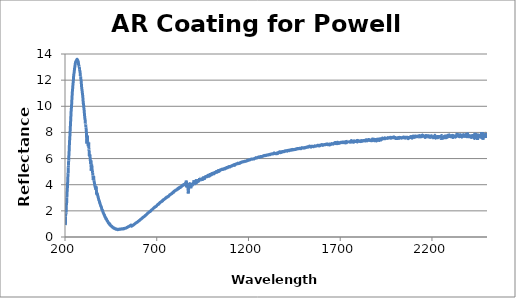
| Category | Reflectance (%) |
|---|---|
| 200.0 | 1.418 |
| 201.0 | 0.923 |
| 202.0 | 0.991 |
| 203.0 | 1.554 |
| 204.0 | 1.776 |
| 205.0 | 1.781 |
| 206.0 | 1.864 |
| 207.0 | 2.298 |
| 208.0 | 2.599 |
| 209.0 | 2.605 |
| 210.0 | 2.997 |
| 211.0 | 3.348 |
| 212.0 | 3.551 |
| 213.0 | 3.762 |
| 214.0 | 4.035 |
| 215.0 | 4.419 |
| 216.0 | 4.682 |
| 217.0 | 4.882 |
| 218.0 | 5.333 |
| 219.0 | 5.486 |
| 220.0 | 5.861 |
| 221.0 | 6.186 |
| 222.0 | 6.41 |
| 223.0 | 6.716 |
| 224.0 | 7.072 |
| 225.0 | 7.347 |
| 226.0 | 7.567 |
| 227.0 | 7.816 |
| 228.0 | 8.131 |
| 229.0 | 8.387 |
| 230.0 | 8.701 |
| 231.0 | 8.914 |
| 232.0 | 9.212 |
| 233.0 | 9.527 |
| 234.0 | 9.72 |
| 235.0 | 9.903 |
| 236.0 | 10.101 |
| 237.0 | 10.371 |
| 238.0 | 10.634 |
| 239.0 | 10.859 |
| 240.0 | 11.093 |
| 241.0 | 11.253 |
| 242.0 | 11.414 |
| 243.0 | 11.603 |
| 244.0 | 11.747 |
| 245.0 | 11.886 |
| 246.0 | 12.073 |
| 247.0 | 12.287 |
| 248.0 | 12.418 |
| 249.0 | 12.503 |
| 250.0 | 12.6 |
| 251.0 | 12.728 |
| 252.0 | 12.857 |
| 253.0 | 12.987 |
| 254.0 | 13.039 |
| 255.0 | 13.155 |
| 256.0 | 13.264 |
| 257.0 | 13.338 |
| 258.0 | 13.397 |
| 259.0 | 13.392 |
| 260.0 | 13.419 |
| 261.0 | 13.489 |
| 262.0 | 13.509 |
| 263.0 | 13.492 |
| 264.0 | 13.503 |
| 265.0 | 13.568 |
| 266.0 | 13.598 |
| 267.0 | 13.498 |
| 268.0 | 13.482 |
| 269.0 | 13.543 |
| 270.0 | 13.455 |
| 271.0 | 13.382 |
| 272.0 | 13.433 |
| 273.0 | 13.328 |
| 274.0 | 13.159 |
| 275.0 | 13.182 |
| 276.0 | 13.101 |
| 277.0 | 13.058 |
| 278.0 | 13.033 |
| 279.0 | 12.839 |
| 280.0 | 12.738 |
| 281.0 | 12.723 |
| 282.0 | 12.631 |
| 283.0 | 12.47 |
| 284.0 | 12.296 |
| 285.0 | 12.294 |
| 286.0 | 12.162 |
| 287.0 | 12.027 |
| 288.0 | 11.93 |
| 289.0 | 11.751 |
| 290.0 | 11.581 |
| 291.0 | 11.418 |
| 292.0 | 11.316 |
| 293.0 | 11.218 |
| 294.0 | 11.094 |
| 295.0 | 10.972 |
| 296.0 | 10.858 |
| 297.0 | 10.718 |
| 298.0 | 10.562 |
| 299.0 | 10.355 |
| 300.0 | 10.194 |
| 301.0 | 10.168 |
| 302.0 | 10.013 |
| 303.0 | 9.858 |
| 304.0 | 9.749 |
| 305.0 | 9.586 |
| 306.0 | 9.392 |
| 307.0 | 9.258 |
| 308.0 | 9.108 |
| 309.0 | 9.032 |
| 310.0 | 8.916 |
| 311.0 | 8.693 |
| 312.0 | 8.656 |
| 313.0 | 8.611 |
| 314.0 | 8.381 |
| 315.0 | 8.308 |
| 316.0 | 8.149 |
| 317.0 | 7.918 |
| 318.0 | 7.578 |
| 319.0 | 7.148 |
| 320.0 | 7.264 |
| 321.0 | 7.668 |
| 322.0 | 7.757 |
| 323.0 | 7.329 |
| 324.0 | 7.272 |
| 325.0 | 7.22 |
| 326.0 | 7.014 |
| 327.0 | 6.952 |
| 328.0 | 7.054 |
| 329.0 | 7.219 |
| 330.0 | 6.803 |
| 331.0 | 6.696 |
| 332.0 | 6.465 |
| 333.0 | 6.159 |
| 334.0 | 6.196 |
| 335.0 | 6.325 |
| 336.0 | 6.184 |
| 337.0 | 6.082 |
| 338.0 | 5.826 |
| 339.0 | 5.79 |
| 340.0 | 5.596 |
| 341.0 | 5.864 |
| 342.0 | 5.533 |
| 343.0 | 5.066 |
| 344.0 | 5.284 |
| 345.0 | 5.549 |
| 346.0 | 5.5 |
| 347.0 | 5.327 |
| 348.0 | 5.129 |
| 349.0 | 5.067 |
| 350.0 | 4.9 |
| 351.0 | 4.898 |
| 352.0 | 4.706 |
| 353.0 | 4.607 |
| 354.0 | 4.375 |
| 355.0 | 4.519 |
| 356.0 | 4.654 |
| 357.0 | 4.404 |
| 358.0 | 4.346 |
| 359.0 | 4.232 |
| 360.0 | 4.172 |
| 361.0 | 4.095 |
| 362.0 | 3.986 |
| 363.0 | 3.894 |
| 364.0 | 3.841 |
| 365.0 | 3.833 |
| 366.0 | 3.924 |
| 367.0 | 3.758 |
| 368.0 | 3.628 |
| 369.0 | 3.875 |
| 370.0 | 3.732 |
| 371.0 | 3.578 |
| 372.0 | 3.28 |
| 373.0 | 3.329 |
| 374.0 | 3.265 |
| 375.0 | 3.334 |
| 376.0 | 3.314 |
| 377.0 | 3.256 |
| 378.0 | 3.18 |
| 379.0 | 3.153 |
| 380.0 | 3.057 |
| 381.0 | 3.036 |
| 382.0 | 2.96 |
| 383.0 | 2.91 |
| 384.0 | 2.839 |
| 385.0 | 2.807 |
| 386.0 | 2.771 |
| 387.0 | 2.764 |
| 388.0 | 2.708 |
| 389.0 | 2.603 |
| 390.0 | 2.611 |
| 391.0 | 2.566 |
| 392.0 | 2.495 |
| 393.0 | 2.463 |
| 394.0 | 2.419 |
| 395.0 | 2.357 |
| 396.0 | 2.331 |
| 397.0 | 2.339 |
| 398.0 | 2.299 |
| 399.0 | 2.228 |
| 400.0 | 2.17 |
| 401.0 | 2.109 |
| 402.0 | 2.075 |
| 403.0 | 2.059 |
| 404.0 | 2.034 |
| 405.0 | 2.038 |
| 406.0 | 1.964 |
| 407.0 | 1.923 |
| 408.0 | 1.856 |
| 409.0 | 1.839 |
| 410.0 | 1.818 |
| 411.0 | 1.777 |
| 412.0 | 1.737 |
| 413.0 | 1.702 |
| 414.0 | 1.706 |
| 415.0 | 1.681 |
| 416.0 | 1.621 |
| 417.0 | 1.567 |
| 418.0 | 1.545 |
| 419.0 | 1.517 |
| 420.0 | 1.523 |
| 421.0 | 1.462 |
| 422.0 | 1.414 |
| 423.0 | 1.389 |
| 424.0 | 1.418 |
| 425.0 | 1.401 |
| 426.0 | 1.373 |
| 427.0 | 1.298 |
| 428.0 | 1.301 |
| 429.0 | 1.253 |
| 430.0 | 1.249 |
| 431.0 | 1.206 |
| 432.0 | 1.221 |
| 433.0 | 1.184 |
| 434.0 | 1.154 |
| 435.0 | 1.112 |
| 436.0 | 1.109 |
| 437.0 | 1.069 |
| 438.0 | 1.083 |
| 439.0 | 1.045 |
| 440.0 | 1.012 |
| 441.0 | 1.057 |
| 442.0 | 0.999 |
| 443.0 | 0.953 |
| 444.0 | 0.966 |
| 445.0 | 0.977 |
| 446.0 | 0.921 |
| 447.0 | 0.91 |
| 448.0 | 0.913 |
| 449.0 | 0.854 |
| 450.0 | 0.864 |
| 451.0 | 0.851 |
| 452.0 | 0.831 |
| 453.0 | 0.832 |
| 454.0 | 0.831 |
| 455.0 | 0.824 |
| 456.0 | 0.789 |
| 457.0 | 0.773 |
| 458.0 | 0.748 |
| 459.0 | 0.751 |
| 460.0 | 0.724 |
| 461.0 | 0.746 |
| 462.0 | 0.728 |
| 463.0 | 0.724 |
| 464.0 | 0.689 |
| 465.0 | 0.688 |
| 466.0 | 0.704 |
| 467.0 | 0.666 |
| 468.0 | 0.667 |
| 469.0 | 0.682 |
| 470.0 | 0.648 |
| 471.0 | 0.651 |
| 472.0 | 0.632 |
| 473.0 | 0.649 |
| 474.0 | 0.63 |
| 475.0 | 0.637 |
| 476.0 | 0.598 |
| 477.0 | 0.612 |
| 478.0 | 0.59 |
| 479.0 | 0.612 |
| 480.0 | 0.607 |
| 481.0 | 0.588 |
| 482.0 | 0.578 |
| 483.0 | 0.591 |
| 484.0 | 0.573 |
| 485.0 | 0.594 |
| 486.0 | 0.581 |
| 487.0 | 0.561 |
| 488.0 | 0.559 |
| 489.0 | 0.58 |
| 490.0 | 0.592 |
| 491.0 | 0.593 |
| 492.0 | 0.589 |
| 493.0 | 0.577 |
| 494.0 | 0.589 |
| 495.0 | 0.581 |
| 496.0 | 0.6 |
| 497.0 | 0.605 |
| 498.0 | 0.592 |
| 499.0 | 0.602 |
| 500.0 | 0.599 |
| 501.0 | 0.611 |
| 502.0 | 0.589 |
| 503.0 | 0.614 |
| 504.0 | 0.598 |
| 505.0 | 0.6 |
| 506.0 | 0.602 |
| 507.0 | 0.607 |
| 508.0 | 0.618 |
| 509.0 | 0.622 |
| 510.0 | 0.633 |
| 511.0 | 0.622 |
| 512.0 | 0.63 |
| 513.0 | 0.615 |
| 514.0 | 0.621 |
| 515.0 | 0.625 |
| 516.0 | 0.608 |
| 517.0 | 0.622 |
| 518.0 | 0.635 |
| 519.0 | 0.643 |
| 520.0 | 0.648 |
| 521.0 | 0.626 |
| 522.0 | 0.639 |
| 523.0 | 0.653 |
| 524.0 | 0.661 |
| 525.0 | 0.657 |
| 526.0 | 0.657 |
| 527.0 | 0.666 |
| 528.0 | 0.673 |
| 529.0 | 0.669 |
| 530.0 | 0.676 |
| 531.0 | 0.669 |
| 532.0 | 0.686 |
| 533.0 | 0.683 |
| 534.0 | 0.692 |
| 535.0 | 0.697 |
| 536.0 | 0.719 |
| 537.0 | 0.734 |
| 538.0 | 0.732 |
| 539.0 | 0.729 |
| 540.0 | 0.738 |
| 541.0 | 0.755 |
| 542.0 | 0.759 |
| 543.0 | 0.774 |
| 544.0 | 0.782 |
| 545.0 | 0.783 |
| 546.0 | 0.787 |
| 547.0 | 0.792 |
| 548.0 | 0.801 |
| 549.0 | 0.804 |
| 550.0 | 0.826 |
| 551.0 | 0.831 |
| 552.0 | 0.841 |
| 553.0 | 0.85 |
| 554.0 | 0.865 |
| 555.0 | 0.865 |
| 556.0 | 0.868 |
| 557.0 | 0.887 |
| 558.0 | 0.892 |
| 559.0 | 0.906 |
| 560.0 | 0.915 |
| 561.0 | 0.899 |
| 562.0 | 0.831 |
| 563.0 | 0.839 |
| 564.0 | 0.845 |
| 565.0 | 0.843 |
| 566.0 | 0.86 |
| 567.0 | 0.863 |
| 568.0 | 0.881 |
| 569.0 | 0.891 |
| 570.0 | 0.891 |
| 571.0 | 0.897 |
| 572.0 | 0.922 |
| 573.0 | 0.935 |
| 574.0 | 0.936 |
| 575.0 | 0.933 |
| 576.0 | 0.945 |
| 577.0 | 0.96 |
| 578.0 | 0.975 |
| 579.0 | 0.993 |
| 580.0 | 0.993 |
| 581.0 | 1.004 |
| 582.0 | 1.015 |
| 583.0 | 1.03 |
| 584.0 | 1.049 |
| 585.0 | 1.066 |
| 586.0 | 1.07 |
| 587.0 | 1.076 |
| 588.0 | 1.091 |
| 589.0 | 1.095 |
| 590.0 | 1.097 |
| 591.0 | 1.107 |
| 592.0 | 1.118 |
| 593.0 | 1.12 |
| 594.0 | 1.138 |
| 595.0 | 1.15 |
| 596.0 | 1.163 |
| 597.0 | 1.178 |
| 598.0 | 1.189 |
| 599.0 | 1.204 |
| 600.0 | 1.205 |
| 601.0 | 1.211 |
| 602.0 | 1.224 |
| 603.0 | 1.243 |
| 604.0 | 1.243 |
| 605.0 | 1.258 |
| 606.0 | 1.267 |
| 607.0 | 1.291 |
| 608.0 | 1.295 |
| 609.0 | 1.312 |
| 610.0 | 1.326 |
| 611.0 | 1.344 |
| 612.0 | 1.349 |
| 613.0 | 1.36 |
| 614.0 | 1.367 |
| 615.0 | 1.382 |
| 616.0 | 1.388 |
| 617.0 | 1.394 |
| 618.0 | 1.413 |
| 619.0 | 1.429 |
| 620.0 | 1.432 |
| 621.0 | 1.442 |
| 622.0 | 1.456 |
| 623.0 | 1.482 |
| 624.0 | 1.498 |
| 625.0 | 1.498 |
| 626.0 | 1.506 |
| 627.0 | 1.515 |
| 628.0 | 1.528 |
| 629.0 | 1.541 |
| 630.0 | 1.551 |
| 631.0 | 1.559 |
| 632.0 | 1.566 |
| 633.0 | 1.583 |
| 634.0 | 1.593 |
| 635.0 | 1.604 |
| 636.0 | 1.613 |
| 637.0 | 1.629 |
| 638.0 | 1.649 |
| 639.0 | 1.66 |
| 640.0 | 1.665 |
| 641.0 | 1.677 |
| 642.0 | 1.696 |
| 643.0 | 1.706 |
| 644.0 | 1.714 |
| 645.0 | 1.731 |
| 646.0 | 1.742 |
| 647.0 | 1.755 |
| 648.0 | 1.772 |
| 649.0 | 1.78 |
| 650.0 | 1.799 |
| 651.0 | 1.83 |
| 652.0 | 1.842 |
| 653.0 | 1.844 |
| 654.0 | 1.86 |
| 655.0 | 1.871 |
| 656.0 | 1.872 |
| 657.0 | 1.886 |
| 658.0 | 1.904 |
| 659.0 | 1.909 |
| 660.0 | 1.92 |
| 661.0 | 1.934 |
| 662.0 | 1.938 |
| 663.0 | 1.937 |
| 664.0 | 1.947 |
| 665.0 | 1.971 |
| 666.0 | 1.984 |
| 667.0 | 1.99 |
| 668.0 | 2.009 |
| 669.0 | 2.024 |
| 670.0 | 2.038 |
| 671.0 | 2.05 |
| 672.0 | 2.067 |
| 673.0 | 2.08 |
| 674.0 | 2.078 |
| 675.0 | 2.095 |
| 676.0 | 2.111 |
| 677.0 | 2.113 |
| 678.0 | 2.129 |
| 679.0 | 2.153 |
| 680.0 | 2.161 |
| 681.0 | 2.172 |
| 682.0 | 2.195 |
| 683.0 | 2.201 |
| 684.0 | 2.217 |
| 685.0 | 2.226 |
| 686.0 | 2.242 |
| 687.0 | 2.264 |
| 688.0 | 2.263 |
| 689.0 | 2.276 |
| 690.0 | 2.297 |
| 691.0 | 2.312 |
| 692.0 | 2.319 |
| 693.0 | 2.326 |
| 694.0 | 2.321 |
| 695.0 | 2.323 |
| 696.0 | 2.333 |
| 697.0 | 2.345 |
| 698.0 | 2.362 |
| 699.0 | 2.371 |
| 700.0 | 2.391 |
| 701.0 | 2.419 |
| 702.0 | 2.429 |
| 703.0 | 2.443 |
| 704.0 | 2.47 |
| 705.0 | 2.483 |
| 706.0 | 2.483 |
| 707.0 | 2.502 |
| 708.0 | 2.502 |
| 709.0 | 2.497 |
| 710.0 | 2.497 |
| 711.0 | 2.527 |
| 712.0 | 2.556 |
| 713.0 | 2.569 |
| 714.0 | 2.559 |
| 715.0 | 2.573 |
| 716.0 | 2.614 |
| 717.0 | 2.633 |
| 718.0 | 2.644 |
| 719.0 | 2.638 |
| 720.0 | 2.658 |
| 721.0 | 2.67 |
| 722.0 | 2.68 |
| 723.0 | 2.684 |
| 724.0 | 2.692 |
| 725.0 | 2.709 |
| 726.0 | 2.705 |
| 727.0 | 2.706 |
| 728.0 | 2.715 |
| 729.0 | 2.759 |
| 730.0 | 2.78 |
| 731.0 | 2.763 |
| 732.0 | 2.766 |
| 733.0 | 2.8 |
| 734.0 | 2.818 |
| 735.0 | 2.844 |
| 736.0 | 2.83 |
| 737.0 | 2.857 |
| 738.0 | 2.859 |
| 739.0 | 2.861 |
| 740.0 | 2.884 |
| 741.0 | 2.88 |
| 742.0 | 2.899 |
| 743.0 | 2.912 |
| 744.0 | 2.922 |
| 745.0 | 2.914 |
| 746.0 | 2.934 |
| 747.0 | 2.95 |
| 748.0 | 2.982 |
| 749.0 | 2.971 |
| 750.0 | 2.971 |
| 751.0 | 2.99 |
| 752.0 | 3.032 |
| 753.0 | 3.043 |
| 754.0 | 3.04 |
| 755.0 | 3.027 |
| 756.0 | 3.046 |
| 757.0 | 3.068 |
| 758.0 | 3.063 |
| 759.0 | 3.058 |
| 760.0 | 3.079 |
| 761.0 | 3.105 |
| 762.0 | 3.098 |
| 763.0 | 3.118 |
| 764.0 | 3.104 |
| 765.0 | 3.116 |
| 766.0 | 3.144 |
| 767.0 | 3.16 |
| 768.0 | 3.172 |
| 769.0 | 3.192 |
| 770.0 | 3.211 |
| 771.0 | 3.236 |
| 772.0 | 3.236 |
| 773.0 | 3.244 |
| 774.0 | 3.24 |
| 775.0 | 3.254 |
| 776.0 | 3.258 |
| 777.0 | 3.288 |
| 778.0 | 3.302 |
| 779.0 | 3.294 |
| 780.0 | 3.303 |
| 781.0 | 3.325 |
| 782.0 | 3.31 |
| 783.0 | 3.326 |
| 784.0 | 3.346 |
| 785.0 | 3.378 |
| 786.0 | 3.369 |
| 787.0 | 3.387 |
| 788.0 | 3.389 |
| 789.0 | 3.421 |
| 790.0 | 3.446 |
| 791.0 | 3.44 |
| 792.0 | 3.415 |
| 793.0 | 3.438 |
| 794.0 | 3.459 |
| 795.0 | 3.507 |
| 796.0 | 3.502 |
| 797.0 | 3.507 |
| 798.0 | 3.513 |
| 799.0 | 3.538 |
| 800.0 | 3.544 |
| 801.0 | 3.565 |
| 802.0 | 3.563 |
| 803.0 | 3.587 |
| 804.0 | 3.572 |
| 805.0 | 3.601 |
| 806.0 | 3.57 |
| 807.0 | 3.613 |
| 808.0 | 3.619 |
| 809.0 | 3.616 |
| 810.0 | 3.634 |
| 811.0 | 3.629 |
| 812.0 | 3.659 |
| 813.0 | 3.686 |
| 814.0 | 3.681 |
| 815.0 | 3.685 |
| 816.0 | 3.67 |
| 817.0 | 3.71 |
| 818.0 | 3.731 |
| 819.0 | 3.751 |
| 820.0 | 3.704 |
| 821.0 | 3.773 |
| 822.0 | 3.752 |
| 823.0 | 3.782 |
| 824.0 | 3.75 |
| 825.0 | 3.795 |
| 826.0 | 3.809 |
| 827.0 | 3.796 |
| 828.0 | 3.781 |
| 829.0 | 3.834 |
| 830.0 | 3.817 |
| 831.0 | 3.848 |
| 832.0 | 3.821 |
| 833.0 | 3.836 |
| 834.0 | 3.869 |
| 835.0 | 3.901 |
| 836.0 | 3.908 |
| 837.0 | 3.929 |
| 838.0 | 3.896 |
| 839.0 | 3.929 |
| 840.0 | 3.96 |
| 841.0 | 3.968 |
| 842.0 | 3.959 |
| 843.0 | 3.965 |
| 844.0 | 3.989 |
| 845.0 | 3.98 |
| 846.0 | 3.958 |
| 847.0 | 3.982 |
| 848.0 | 4.003 |
| 849.0 | 4.03 |
| 850.0 | 4.018 |
| 851.0 | 4.041 |
| 852.0 | 4.053 |
| 853.0 | 4.05 |
| 854.0 | 4.082 |
| 855.0 | 4.081 |
| 856.0 | 4.098 |
| 857.0 | 4.101 |
| 858.0 | 4.125 |
| 859.0 | 4.145 |
| 860.0 | 4.112 |
| 861.0 | 4.316 |
| 862.0 | 4.213 |
| 863.0 | 3.782 |
| 864.0 | 3.799 |
| 865.0 | 3.939 |
| 866.0 | 3.841 |
| 867.0 | 3.995 |
| 868.0 | 4.025 |
| 869.0 | 3.879 |
| 870.0 | 3.832 |
| 871.0 | 3.58 |
| 872.0 | 3.328 |
| 873.0 | 3.581 |
| 874.0 | 3.704 |
| 875.0 | 3.71 |
| 876.0 | 3.829 |
| 877.0 | 4.11 |
| 878.0 | 4.031 |
| 879.0 | 4.071 |
| 880.0 | 4.087 |
| 881.0 | 4.075 |
| 882.0 | 4.068 |
| 883.0 | 3.939 |
| 884.0 | 3.921 |
| 885.0 | 3.9 |
| 886.0 | 3.733 |
| 887.0 | 3.795 |
| 888.0 | 3.954 |
| 889.0 | 4.061 |
| 890.0 | 4.006 |
| 891.0 | 4.037 |
| 892.0 | 3.928 |
| 893.0 | 3.976 |
| 894.0 | 3.975 |
| 895.0 | 3.931 |
| 896.0 | 4.076 |
| 897.0 | 4.012 |
| 898.0 | 4.103 |
| 899.0 | 4.055 |
| 900.0 | 4.105 |
| 901.0 | 4.09 |
| 902.0 | 4.049 |
| 903.0 | 4.345 |
| 904.0 | 4.184 |
| 905.0 | 4.174 |
| 906.0 | 4.007 |
| 907.0 | 4.097 |
| 908.0 | 4.102 |
| 909.0 | 4.065 |
| 910.0 | 4.124 |
| 911.0 | 4.215 |
| 912.0 | 4.256 |
| 913.0 | 4.303 |
| 914.0 | 4.33 |
| 915.0 | 4.297 |
| 916.0 | 4.152 |
| 917.0 | 4.157 |
| 918.0 | 4.215 |
| 919.0 | 4.229 |
| 920.0 | 4.197 |
| 921.0 | 4.216 |
| 922.0 | 4.306 |
| 923.0 | 4.324 |
| 924.0 | 4.281 |
| 925.0 | 4.247 |
| 926.0 | 4.323 |
| 927.0 | 4.238 |
| 928.0 | 4.281 |
| 929.0 | 4.312 |
| 930.0 | 4.33 |
| 931.0 | 4.296 |
| 932.0 | 4.348 |
| 933.0 | 4.505 |
| 934.0 | 4.5 |
| 935.0 | 4.503 |
| 936.0 | 4.329 |
| 937.0 | 4.392 |
| 938.0 | 4.413 |
| 939.0 | 4.424 |
| 940.0 | 4.395 |
| 941.0 | 4.372 |
| 942.0 | 4.391 |
| 943.0 | 4.384 |
| 944.0 | 4.385 |
| 945.0 | 4.393 |
| 946.0 | 4.423 |
| 947.0 | 4.415 |
| 948.0 | 4.536 |
| 949.0 | 4.434 |
| 950.0 | 4.403 |
| 951.0 | 4.411 |
| 952.0 | 4.527 |
| 953.0 | 4.523 |
| 954.0 | 4.512 |
| 955.0 | 4.525 |
| 956.0 | 4.463 |
| 957.0 | 4.512 |
| 958.0 | 4.532 |
| 959.0 | 4.554 |
| 960.0 | 4.506 |
| 961.0 | 4.466 |
| 962.0 | 4.489 |
| 963.0 | 4.519 |
| 964.0 | 4.611 |
| 965.0 | 4.573 |
| 966.0 | 4.608 |
| 967.0 | 4.581 |
| 968.0 | 4.629 |
| 969.0 | 4.61 |
| 970.0 | 4.639 |
| 971.0 | 4.643 |
| 972.0 | 4.648 |
| 973.0 | 4.627 |
| 974.0 | 4.629 |
| 975.0 | 4.623 |
| 976.0 | 4.614 |
| 977.0 | 4.632 |
| 978.0 | 4.702 |
| 979.0 | 4.699 |
| 980.0 | 4.722 |
| 981.0 | 4.722 |
| 982.0 | 4.714 |
| 983.0 | 4.707 |
| 984.0 | 4.716 |
| 985.0 | 4.705 |
| 986.0 | 4.646 |
| 987.0 | 4.733 |
| 988.0 | 4.705 |
| 989.0 | 4.786 |
| 990.0 | 4.735 |
| 991.0 | 4.754 |
| 992.0 | 4.752 |
| 993.0 | 4.715 |
| 994.0 | 4.765 |
| 995.0 | 4.794 |
| 996.0 | 4.791 |
| 997.0 | 4.826 |
| 998.0 | 4.755 |
| 999.0 | 4.842 |
| 1000.0 | 4.841 |
| 1001.0 | 4.783 |
| 1002.0 | 4.819 |
| 1003.0 | 4.846 |
| 1004.0 | 4.835 |
| 1005.0 | 4.867 |
| 1006.0 | 4.873 |
| 1007.0 | 4.85 |
| 1008.0 | 4.892 |
| 1009.0 | 4.861 |
| 1010.0 | 4.858 |
| 1011.0 | 4.882 |
| 1012.0 | 4.829 |
| 1013.0 | 4.863 |
| 1014.0 | 4.929 |
| 1015.0 | 4.899 |
| 1016.0 | 4.925 |
| 1017.0 | 4.899 |
| 1018.0 | 4.925 |
| 1019.0 | 4.905 |
| 1020.0 | 4.92 |
| 1021.0 | 4.921 |
| 1022.0 | 4.952 |
| 1023.0 | 4.966 |
| 1024.0 | 5.009 |
| 1025.0 | 4.954 |
| 1026.0 | 4.984 |
| 1027.0 | 4.97 |
| 1028.0 | 4.978 |
| 1029.0 | 4.946 |
| 1030.0 | 5.027 |
| 1031.0 | 4.999 |
| 1032.0 | 5.009 |
| 1033.0 | 5.008 |
| 1034.0 | 5.026 |
| 1035.0 | 5.087 |
| 1036.0 | 5.072 |
| 1037.0 | 5.01 |
| 1038.0 | 5.064 |
| 1039.0 | 5.085 |
| 1040.0 | 5.037 |
| 1041.0 | 5.032 |
| 1042.0 | 5.095 |
| 1043.0 | 5.1 |
| 1044.0 | 5.122 |
| 1045.0 | 5.076 |
| 1046.0 | 5.122 |
| 1047.0 | 5.108 |
| 1048.0 | 5.121 |
| 1049.0 | 5.144 |
| 1050.0 | 5.13 |
| 1051.0 | 5.16 |
| 1052.0 | 5.177 |
| 1053.0 | 5.172 |
| 1054.0 | 5.176 |
| 1055.0 | 5.175 |
| 1056.0 | 5.184 |
| 1057.0 | 5.196 |
| 1058.0 | 5.187 |
| 1059.0 | 5.159 |
| 1060.0 | 5.171 |
| 1061.0 | 5.195 |
| 1062.0 | 5.198 |
| 1063.0 | 5.198 |
| 1064.0 | 5.21 |
| 1065.0 | 5.222 |
| 1066.0 | 5.195 |
| 1067.0 | 5.202 |
| 1068.0 | 5.209 |
| 1069.0 | 5.234 |
| 1070.0 | 5.231 |
| 1071.0 | 5.244 |
| 1072.0 | 5.203 |
| 1073.0 | 5.249 |
| 1074.0 | 5.274 |
| 1075.0 | 5.26 |
| 1076.0 | 5.245 |
| 1077.0 | 5.256 |
| 1078.0 | 5.276 |
| 1079.0 | 5.275 |
| 1080.0 | 5.273 |
| 1081.0 | 5.279 |
| 1082.0 | 5.324 |
| 1083.0 | 5.312 |
| 1084.0 | 5.323 |
| 1085.0 | 5.322 |
| 1086.0 | 5.298 |
| 1087.0 | 5.334 |
| 1088.0 | 5.327 |
| 1089.0 | 5.324 |
| 1090.0 | 5.34 |
| 1091.0 | 5.375 |
| 1092.0 | 5.379 |
| 1093.0 | 5.385 |
| 1094.0 | 5.385 |
| 1095.0 | 5.352 |
| 1096.0 | 5.36 |
| 1097.0 | 5.358 |
| 1098.0 | 5.379 |
| 1099.0 | 5.388 |
| 1100.0 | 5.368 |
| 1101.0 | 5.37 |
| 1102.0 | 5.401 |
| 1103.0 | 5.396 |
| 1104.0 | 5.4 |
| 1105.0 | 5.407 |
| 1106.0 | 5.441 |
| 1107.0 | 5.434 |
| 1108.0 | 5.435 |
| 1109.0 | 5.424 |
| 1110.0 | 5.431 |
| 1111.0 | 5.446 |
| 1112.0 | 5.462 |
| 1113.0 | 5.472 |
| 1114.0 | 5.462 |
| 1115.0 | 5.471 |
| 1116.0 | 5.495 |
| 1117.0 | 5.484 |
| 1118.0 | 5.495 |
| 1119.0 | 5.521 |
| 1120.0 | 5.525 |
| 1121.0 | 5.508 |
| 1122.0 | 5.526 |
| 1123.0 | 5.535 |
| 1124.0 | 5.504 |
| 1125.0 | 5.48 |
| 1126.0 | 5.544 |
| 1127.0 | 5.555 |
| 1128.0 | 5.545 |
| 1129.0 | 5.564 |
| 1130.0 | 5.575 |
| 1131.0 | 5.584 |
| 1132.0 | 5.565 |
| 1133.0 | 5.571 |
| 1134.0 | 5.568 |
| 1135.0 | 5.575 |
| 1136.0 | 5.592 |
| 1137.0 | 5.608 |
| 1138.0 | 5.616 |
| 1139.0 | 5.609 |
| 1140.0 | 5.62 |
| 1141.0 | 5.65 |
| 1142.0 | 5.63 |
| 1143.0 | 5.609 |
| 1144.0 | 5.615 |
| 1145.0 | 5.624 |
| 1146.0 | 5.629 |
| 1147.0 | 5.617 |
| 1148.0 | 5.625 |
| 1149.0 | 5.621 |
| 1150.0 | 5.65 |
| 1151.0 | 5.651 |
| 1152.0 | 5.634 |
| 1153.0 | 5.636 |
| 1154.0 | 5.658 |
| 1155.0 | 5.683 |
| 1156.0 | 5.699 |
| 1157.0 | 5.707 |
| 1158.0 | 5.698 |
| 1159.0 | 5.687 |
| 1160.0 | 5.7 |
| 1161.0 | 5.726 |
| 1162.0 | 5.72 |
| 1163.0 | 5.716 |
| 1164.0 | 5.727 |
| 1165.0 | 5.748 |
| 1166.0 | 5.746 |
| 1167.0 | 5.735 |
| 1168.0 | 5.737 |
| 1169.0 | 5.741 |
| 1170.0 | 5.749 |
| 1171.0 | 5.764 |
| 1172.0 | 5.759 |
| 1173.0 | 5.752 |
| 1174.0 | 5.757 |
| 1175.0 | 5.758 |
| 1176.0 | 5.775 |
| 1177.0 | 5.789 |
| 1178.0 | 5.785 |
| 1179.0 | 5.792 |
| 1180.0 | 5.802 |
| 1181.0 | 5.796 |
| 1182.0 | 5.789 |
| 1183.0 | 5.79 |
| 1184.0 | 5.783 |
| 1185.0 | 5.797 |
| 1186.0 | 5.797 |
| 1187.0 | 5.807 |
| 1188.0 | 5.824 |
| 1189.0 | 5.827 |
| 1190.0 | 5.829 |
| 1191.0 | 5.835 |
| 1192.0 | 5.849 |
| 1193.0 | 5.841 |
| 1194.0 | 5.837 |
| 1195.0 | 5.836 |
| 1196.0 | 5.849 |
| 1197.0 | 5.88 |
| 1198.0 | 5.885 |
| 1199.0 | 5.885 |
| 1200.0 | 5.887 |
| 1201.0 | 5.875 |
| 1202.0 | 5.881 |
| 1203.0 | 5.883 |
| 1204.0 | 5.889 |
| 1205.0 | 5.908 |
| 1206.0 | 5.91 |
| 1207.0 | 5.902 |
| 1208.0 | 5.895 |
| 1209.0 | 5.916 |
| 1210.0 | 5.929 |
| 1211.0 | 5.921 |
| 1212.0 | 5.926 |
| 1213.0 | 5.934 |
| 1214.0 | 5.947 |
| 1215.0 | 5.963 |
| 1216.0 | 5.962 |
| 1217.0 | 5.946 |
| 1218.0 | 5.943 |
| 1219.0 | 5.941 |
| 1220.0 | 5.962 |
| 1221.0 | 5.967 |
| 1222.0 | 5.954 |
| 1223.0 | 5.97 |
| 1224.0 | 5.972 |
| 1225.0 | 5.97 |
| 1226.0 | 5.968 |
| 1227.0 | 5.978 |
| 1228.0 | 5.989 |
| 1229.0 | 5.992 |
| 1230.0 | 5.985 |
| 1231.0 | 5.97 |
| 1232.0 | 5.979 |
| 1233.0 | 5.994 |
| 1234.0 | 6.012 |
| 1235.0 | 6.021 |
| 1236.0 | 6.02 |
| 1237.0 | 6.035 |
| 1238.0 | 6.04 |
| 1239.0 | 6.056 |
| 1240.0 | 6.073 |
| 1241.0 | 6.059 |
| 1242.0 | 6.041 |
| 1243.0 | 6.034 |
| 1244.0 | 6.053 |
| 1245.0 | 6.064 |
| 1246.0 | 6.056 |
| 1247.0 | 6.052 |
| 1248.0 | 6.059 |
| 1249.0 | 6.091 |
| 1250.0 | 6.092 |
| 1251.0 | 6.095 |
| 1252.0 | 6.096 |
| 1253.0 | 6.101 |
| 1254.0 | 6.112 |
| 1255.0 | 6.113 |
| 1256.0 | 6.129 |
| 1257.0 | 6.131 |
| 1258.0 | 6.131 |
| 1259.0 | 6.124 |
| 1260.0 | 6.09 |
| 1261.0 | 6.096 |
| 1262.0 | 6.098 |
| 1263.0 | 6.115 |
| 1264.0 | 6.145 |
| 1265.0 | 6.152 |
| 1266.0 | 6.151 |
| 1267.0 | 6.154 |
| 1268.0 | 6.16 |
| 1269.0 | 6.146 |
| 1270.0 | 6.151 |
| 1271.0 | 6.144 |
| 1272.0 | 6.15 |
| 1273.0 | 6.16 |
| 1274.0 | 6.166 |
| 1275.0 | 6.157 |
| 1276.0 | 6.167 |
| 1277.0 | 6.179 |
| 1278.0 | 6.173 |
| 1279.0 | 6.178 |
| 1280.0 | 6.198 |
| 1281.0 | 6.205 |
| 1282.0 | 6.219 |
| 1283.0 | 6.227 |
| 1284.0 | 6.23 |
| 1285.0 | 6.223 |
| 1286.0 | 6.215 |
| 1287.0 | 6.221 |
| 1288.0 | 6.246 |
| 1289.0 | 6.23 |
| 1290.0 | 6.232 |
| 1291.0 | 6.217 |
| 1292.0 | 6.234 |
| 1293.0 | 6.248 |
| 1294.0 | 6.252 |
| 1295.0 | 6.256 |
| 1296.0 | 6.243 |
| 1297.0 | 6.237 |
| 1298.0 | 6.264 |
| 1299.0 | 6.256 |
| 1300.0 | 6.251 |
| 1301.0 | 6.263 |
| 1302.0 | 6.265 |
| 1303.0 | 6.279 |
| 1304.0 | 6.279 |
| 1305.0 | 6.274 |
| 1306.0 | 6.287 |
| 1307.0 | 6.294 |
| 1308.0 | 6.294 |
| 1309.0 | 6.288 |
| 1310.0 | 6.278 |
| 1311.0 | 6.286 |
| 1312.0 | 6.294 |
| 1313.0 | 6.306 |
| 1314.0 | 6.327 |
| 1315.0 | 6.306 |
| 1316.0 | 6.303 |
| 1317.0 | 6.316 |
| 1318.0 | 6.299 |
| 1319.0 | 6.307 |
| 1320.0 | 6.316 |
| 1321.0 | 6.339 |
| 1322.0 | 6.335 |
| 1323.0 | 6.331 |
| 1324.0 | 6.341 |
| 1325.0 | 6.34 |
| 1326.0 | 6.355 |
| 1327.0 | 6.361 |
| 1328.0 | 6.364 |
| 1329.0 | 6.365 |
| 1330.0 | 6.36 |
| 1331.0 | 6.35 |
| 1332.0 | 6.345 |
| 1333.0 | 6.366 |
| 1334.0 | 6.379 |
| 1335.0 | 6.382 |
| 1336.0 | 6.383 |
| 1337.0 | 6.365 |
| 1338.0 | 6.403 |
| 1339.0 | 6.417 |
| 1340.0 | 6.439 |
| 1341.0 | 6.417 |
| 1342.0 | 6.391 |
| 1343.0 | 6.407 |
| 1344.0 | 6.392 |
| 1345.0 | 6.384 |
| 1346.0 | 6.384 |
| 1347.0 | 6.382 |
| 1348.0 | 6.374 |
| 1349.0 | 6.371 |
| 1350.0 | 6.367 |
| 1351.0 | 6.385 |
| 1352.0 | 6.405 |
| 1353.0 | 6.373 |
| 1354.0 | 6.366 |
| 1355.0 | 6.387 |
| 1356.0 | 6.374 |
| 1357.0 | 6.437 |
| 1358.0 | 6.443 |
| 1359.0 | 6.392 |
| 1360.0 | 6.388 |
| 1361.0 | 6.434 |
| 1362.0 | 6.46 |
| 1363.0 | 6.451 |
| 1364.0 | 6.474 |
| 1365.0 | 6.484 |
| 1366.0 | 6.471 |
| 1367.0 | 6.468 |
| 1368.0 | 6.493 |
| 1369.0 | 6.518 |
| 1370.0 | 6.477 |
| 1371.0 | 6.509 |
| 1372.0 | 6.52 |
| 1373.0 | 6.454 |
| 1374.0 | 6.462 |
| 1375.0 | 6.494 |
| 1376.0 | 6.479 |
| 1377.0 | 6.501 |
| 1378.0 | 6.517 |
| 1379.0 | 6.504 |
| 1380.0 | 6.474 |
| 1381.0 | 6.48 |
| 1382.0 | 6.521 |
| 1383.0 | 6.533 |
| 1384.0 | 6.538 |
| 1385.0 | 6.521 |
| 1386.0 | 6.549 |
| 1387.0 | 6.52 |
| 1388.0 | 6.516 |
| 1389.0 | 6.531 |
| 1390.0 | 6.522 |
| 1391.0 | 6.547 |
| 1392.0 | 6.522 |
| 1393.0 | 6.547 |
| 1394.0 | 6.558 |
| 1395.0 | 6.556 |
| 1396.0 | 6.528 |
| 1397.0 | 6.558 |
| 1398.0 | 6.586 |
| 1399.0 | 6.557 |
| 1400.0 | 6.586 |
| 1401.0 | 6.597 |
| 1402.0 | 6.568 |
| 1403.0 | 6.598 |
| 1404.0 | 6.598 |
| 1405.0 | 6.597 |
| 1406.0 | 6.602 |
| 1407.0 | 6.58 |
| 1408.0 | 6.602 |
| 1409.0 | 6.606 |
| 1410.0 | 6.582 |
| 1411.0 | 6.559 |
| 1412.0 | 6.578 |
| 1413.0 | 6.584 |
| 1414.0 | 6.584 |
| 1415.0 | 6.62 |
| 1416.0 | 6.636 |
| 1417.0 | 6.624 |
| 1418.0 | 6.615 |
| 1419.0 | 6.625 |
| 1420.0 | 6.627 |
| 1421.0 | 6.643 |
| 1422.0 | 6.616 |
| 1423.0 | 6.61 |
| 1424.0 | 6.609 |
| 1425.0 | 6.651 |
| 1426.0 | 6.634 |
| 1427.0 | 6.644 |
| 1428.0 | 6.642 |
| 1429.0 | 6.663 |
| 1430.0 | 6.673 |
| 1431.0 | 6.668 |
| 1432.0 | 6.662 |
| 1433.0 | 6.65 |
| 1434.0 | 6.64 |
| 1435.0 | 6.654 |
| 1436.0 | 6.692 |
| 1437.0 | 6.686 |
| 1438.0 | 6.661 |
| 1439.0 | 6.7 |
| 1440.0 | 6.7 |
| 1441.0 | 6.661 |
| 1442.0 | 6.673 |
| 1443.0 | 6.668 |
| 1444.0 | 6.679 |
| 1445.0 | 6.681 |
| 1446.0 | 6.698 |
| 1447.0 | 6.696 |
| 1448.0 | 6.678 |
| 1449.0 | 6.698 |
| 1450.0 | 6.699 |
| 1451.0 | 6.684 |
| 1452.0 | 6.689 |
| 1453.0 | 6.711 |
| 1454.0 | 6.697 |
| 1455.0 | 6.715 |
| 1456.0 | 6.726 |
| 1457.0 | 6.696 |
| 1458.0 | 6.719 |
| 1459.0 | 6.738 |
| 1460.0 | 6.735 |
| 1461.0 | 6.73 |
| 1462.0 | 6.717 |
| 1463.0 | 6.722 |
| 1464.0 | 6.723 |
| 1465.0 | 6.734 |
| 1466.0 | 6.768 |
| 1467.0 | 6.775 |
| 1468.0 | 6.758 |
| 1469.0 | 6.765 |
| 1470.0 | 6.748 |
| 1471.0 | 6.763 |
| 1472.0 | 6.758 |
| 1473.0 | 6.751 |
| 1474.0 | 6.757 |
| 1475.0 | 6.77 |
| 1476.0 | 6.762 |
| 1477.0 | 6.779 |
| 1478.0 | 6.761 |
| 1479.0 | 6.786 |
| 1480.0 | 6.792 |
| 1481.0 | 6.768 |
| 1482.0 | 6.761 |
| 1483.0 | 6.786 |
| 1484.0 | 6.792 |
| 1485.0 | 6.777 |
| 1486.0 | 6.761 |
| 1487.0 | 6.76 |
| 1488.0 | 6.784 |
| 1489.0 | 6.799 |
| 1490.0 | 6.828 |
| 1491.0 | 6.836 |
| 1492.0 | 6.815 |
| 1493.0 | 6.816 |
| 1494.0 | 6.823 |
| 1495.0 | 6.811 |
| 1496.0 | 6.819 |
| 1497.0 | 6.805 |
| 1498.0 | 6.807 |
| 1499.0 | 6.823 |
| 1500.0 | 6.826 |
| 1501.0 | 6.811 |
| 1502.0 | 6.796 |
| 1503.0 | 6.826 |
| 1504.0 | 6.824 |
| 1505.0 | 6.808 |
| 1506.0 | 6.806 |
| 1507.0 | 6.83 |
| 1508.0 | 6.849 |
| 1509.0 | 6.845 |
| 1510.0 | 6.842 |
| 1511.0 | 6.832 |
| 1512.0 | 6.844 |
| 1513.0 | 6.852 |
| 1514.0 | 6.84 |
| 1515.0 | 6.867 |
| 1516.0 | 6.875 |
| 1517.0 | 6.857 |
| 1518.0 | 6.863 |
| 1519.0 | 6.889 |
| 1520.0 | 6.895 |
| 1521.0 | 6.894 |
| 1522.0 | 6.869 |
| 1523.0 | 6.859 |
| 1524.0 | 6.861 |
| 1525.0 | 6.879 |
| 1526.0 | 6.907 |
| 1527.0 | 6.913 |
| 1528.0 | 6.907 |
| 1529.0 | 6.923 |
| 1530.0 | 6.912 |
| 1531.0 | 6.949 |
| 1532.0 | 6.951 |
| 1533.0 | 6.93 |
| 1534.0 | 6.908 |
| 1535.0 | 6.905 |
| 1536.0 | 6.907 |
| 1537.0 | 6.9 |
| 1538.0 | 6.903 |
| 1539.0 | 6.934 |
| 1540.0 | 6.89 |
| 1541.0 | 6.873 |
| 1542.0 | 6.934 |
| 1543.0 | 6.934 |
| 1544.0 | 6.91 |
| 1545.0 | 6.922 |
| 1546.0 | 6.917 |
| 1547.0 | 6.926 |
| 1548.0 | 6.949 |
| 1549.0 | 6.941 |
| 1550.0 | 6.924 |
| 1551.0 | 6.929 |
| 1552.0 | 6.928 |
| 1553.0 | 6.914 |
| 1554.0 | 6.916 |
| 1555.0 | 6.905 |
| 1556.0 | 6.926 |
| 1557.0 | 6.94 |
| 1558.0 | 6.927 |
| 1559.0 | 6.938 |
| 1560.0 | 6.969 |
| 1561.0 | 6.972 |
| 1562.0 | 6.978 |
| 1563.0 | 6.965 |
| 1564.0 | 6.938 |
| 1565.0 | 6.939 |
| 1566.0 | 6.947 |
| 1567.0 | 6.947 |
| 1568.0 | 6.951 |
| 1569.0 | 6.962 |
| 1570.0 | 6.967 |
| 1571.0 | 6.966 |
| 1572.0 | 6.965 |
| 1573.0 | 6.987 |
| 1574.0 | 6.994 |
| 1575.0 | 6.98 |
| 1576.0 | 7.002 |
| 1577.0 | 7.025 |
| 1578.0 | 7.009 |
| 1579.0 | 6.99 |
| 1580.0 | 6.998 |
| 1581.0 | 6.989 |
| 1582.0 | 6.99 |
| 1583.0 | 6.999 |
| 1584.0 | 6.98 |
| 1585.0 | 6.961 |
| 1586.0 | 6.989 |
| 1587.0 | 7.02 |
| 1588.0 | 7.016 |
| 1589.0 | 6.983 |
| 1590.0 | 6.99 |
| 1591.0 | 6.994 |
| 1592.0 | 7.006 |
| 1593.0 | 7.037 |
| 1594.0 | 7.036 |
| 1595.0 | 7.049 |
| 1596.0 | 7.047 |
| 1597.0 | 7.046 |
| 1598.0 | 7.062 |
| 1599.0 | 7.055 |
| 1600.0 | 7.073 |
| 1601.0 | 7.073 |
| 1602.0 | 7.028 |
| 1603.0 | 7.011 |
| 1604.0 | 7.011 |
| 1605.0 | 7.029 |
| 1606.0 | 7.037 |
| 1607.0 | 7.02 |
| 1608.0 | 7.029 |
| 1609.0 | 7.047 |
| 1610.0 | 7.055 |
| 1611.0 | 7.052 |
| 1612.0 | 7.07 |
| 1613.0 | 7.081 |
| 1614.0 | 7.075 |
| 1615.0 | 7.081 |
| 1616.0 | 7.073 |
| 1617.0 | 7.079 |
| 1618.0 | 7.057 |
| 1619.0 | 7.056 |
| 1620.0 | 7.088 |
| 1621.0 | 7.07 |
| 1622.0 | 7.077 |
| 1623.0 | 7.103 |
| 1624.0 | 7.112 |
| 1625.0 | 7.116 |
| 1626.0 | 7.116 |
| 1627.0 | 7.085 |
| 1628.0 | 7.108 |
| 1629.0 | 7.121 |
| 1630.0 | 7.127 |
| 1631.0 | 7.121 |
| 1632.0 | 7.093 |
| 1633.0 | 7.074 |
| 1634.0 | 7.048 |
| 1635.0 | 7.073 |
| 1636.0 | 7.077 |
| 1637.0 | 7.097 |
| 1638.0 | 7.091 |
| 1639.0 | 7.092 |
| 1640.0 | 7.074 |
| 1641.0 | 7.061 |
| 1642.0 | 7.036 |
| 1643.0 | 7.108 |
| 1644.0 | 7.118 |
| 1645.0 | 7.077 |
| 1646.0 | 7.083 |
| 1647.0 | 7.065 |
| 1648.0 | 7.094 |
| 1649.0 | 7.098 |
| 1650.0 | 7.109 |
| 1651.0 | 7.096 |
| 1652.0 | 7.095 |
| 1653.0 | 7.109 |
| 1654.0 | 7.145 |
| 1655.0 | 7.132 |
| 1656.0 | 7.14 |
| 1657.0 | 7.121 |
| 1658.0 | 7.141 |
| 1659.0 | 7.122 |
| 1660.0 | 7.113 |
| 1661.0 | 7.1 |
| 1662.0 | 7.118 |
| 1663.0 | 7.117 |
| 1664.0 | 7.125 |
| 1665.0 | 7.156 |
| 1666.0 | 7.181 |
| 1667.0 | 7.164 |
| 1668.0 | 7.171 |
| 1669.0 | 7.178 |
| 1670.0 | 7.168 |
| 1671.0 | 7.181 |
| 1672.0 | 7.235 |
| 1673.0 | 7.19 |
| 1674.0 | 7.163 |
| 1675.0 | 7.15 |
| 1676.0 | 7.145 |
| 1677.0 | 7.171 |
| 1678.0 | 7.181 |
| 1679.0 | 7.159 |
| 1680.0 | 7.183 |
| 1681.0 | 7.168 |
| 1682.0 | 7.137 |
| 1683.0 | 7.152 |
| 1684.0 | 7.245 |
| 1685.0 | 7.223 |
| 1686.0 | 7.192 |
| 1687.0 | 7.242 |
| 1688.0 | 7.218 |
| 1689.0 | 7.182 |
| 1690.0 | 7.164 |
| 1691.0 | 7.197 |
| 1692.0 | 7.197 |
| 1693.0 | 7.16 |
| 1694.0 | 7.17 |
| 1695.0 | 7.199 |
| 1696.0 | 7.185 |
| 1697.0 | 7.225 |
| 1698.0 | 7.188 |
| 1699.0 | 7.231 |
| 1700.0 | 7.192 |
| 1701.0 | 7.239 |
| 1702.0 | 7.226 |
| 1703.0 | 7.201 |
| 1704.0 | 7.23 |
| 1705.0 | 7.23 |
| 1706.0 | 7.253 |
| 1707.0 | 7.244 |
| 1708.0 | 7.227 |
| 1709.0 | 7.222 |
| 1710.0 | 7.233 |
| 1711.0 | 7.258 |
| 1712.0 | 7.267 |
| 1713.0 | 7.269 |
| 1714.0 | 7.263 |
| 1715.0 | 7.212 |
| 1716.0 | 7.226 |
| 1717.0 | 7.274 |
| 1718.0 | 7.229 |
| 1719.0 | 7.256 |
| 1720.0 | 7.251 |
| 1721.0 | 7.228 |
| 1722.0 | 7.222 |
| 1723.0 | 7.217 |
| 1724.0 | 7.214 |
| 1725.0 | 7.205 |
| 1726.0 | 7.218 |
| 1727.0 | 7.286 |
| 1728.0 | 7.274 |
| 1729.0 | 7.259 |
| 1730.0 | 7.196 |
| 1731.0 | 7.251 |
| 1732.0 | 7.309 |
| 1733.0 | 7.27 |
| 1734.0 | 7.207 |
| 1735.0 | 7.263 |
| 1736.0 | 7.234 |
| 1737.0 | 7.309 |
| 1738.0 | 7.307 |
| 1739.0 | 7.271 |
| 1740.0 | 7.27 |
| 1741.0 | 7.288 |
| 1742.0 | 7.291 |
| 1743.0 | 7.339 |
| 1744.0 | 7.212 |
| 1745.0 | 7.226 |
| 1746.0 | 7.261 |
| 1747.0 | 7.243 |
| 1748.0 | 7.258 |
| 1749.0 | 7.277 |
| 1750.0 | 7.288 |
| 1751.0 | 7.297 |
| 1752.0 | 7.288 |
| 1753.0 | 7.276 |
| 1754.0 | 7.3 |
| 1755.0 | 7.274 |
| 1756.0 | 7.261 |
| 1757.0 | 7.295 |
| 1758.0 | 7.264 |
| 1759.0 | 7.261 |
| 1760.0 | 7.371 |
| 1761.0 | 7.353 |
| 1762.0 | 7.321 |
| 1763.0 | 7.299 |
| 1764.0 | 7.332 |
| 1765.0 | 7.284 |
| 1766.0 | 7.319 |
| 1767.0 | 7.273 |
| 1768.0 | 7.283 |
| 1769.0 | 7.259 |
| 1770.0 | 7.317 |
| 1771.0 | 7.286 |
| 1772.0 | 7.352 |
| 1773.0 | 7.306 |
| 1774.0 | 7.246 |
| 1775.0 | 7.315 |
| 1776.0 | 7.361 |
| 1777.0 | 7.309 |
| 1778.0 | 7.325 |
| 1779.0 | 7.316 |
| 1780.0 | 7.328 |
| 1781.0 | 7.312 |
| 1782.0 | 7.336 |
| 1783.0 | 7.311 |
| 1784.0 | 7.326 |
| 1785.0 | 7.307 |
| 1786.0 | 7.35 |
| 1787.0 | 7.311 |
| 1788.0 | 7.303 |
| 1789.0 | 7.331 |
| 1790.0 | 7.297 |
| 1791.0 | 7.376 |
| 1792.0 | 7.367 |
| 1793.0 | 7.269 |
| 1794.0 | 7.309 |
| 1795.0 | 7.331 |
| 1796.0 | 7.392 |
| 1797.0 | 7.33 |
| 1798.0 | 7.324 |
| 1799.0 | 7.331 |
| 1800.0 | 7.367 |
| 1801.0 | 7.333 |
| 1802.0 | 7.351 |
| 1803.0 | 7.349 |
| 1804.0 | 7.345 |
| 1805.0 | 7.343 |
| 1806.0 | 7.311 |
| 1807.0 | 7.307 |
| 1808.0 | 7.356 |
| 1809.0 | 7.325 |
| 1810.0 | 7.349 |
| 1811.0 | 7.297 |
| 1812.0 | 7.337 |
| 1813.0 | 7.343 |
| 1814.0 | 7.335 |
| 1815.0 | 7.382 |
| 1816.0 | 7.339 |
| 1817.0 | 7.315 |
| 1818.0 | 7.347 |
| 1819.0 | 7.328 |
| 1820.0 | 7.338 |
| 1821.0 | 7.369 |
| 1822.0 | 7.331 |
| 1823.0 | 7.338 |
| 1824.0 | 7.377 |
| 1825.0 | 7.357 |
| 1826.0 | 7.364 |
| 1827.0 | 7.362 |
| 1828.0 | 7.376 |
| 1829.0 | 7.38 |
| 1830.0 | 7.383 |
| 1831.0 | 7.38 |
| 1832.0 | 7.386 |
| 1833.0 | 7.353 |
| 1834.0 | 7.382 |
| 1835.0 | 7.369 |
| 1836.0 | 7.345 |
| 1837.0 | 7.351 |
| 1838.0 | 7.343 |
| 1839.0 | 7.407 |
| 1840.0 | 7.436 |
| 1841.0 | 7.426 |
| 1842.0 | 7.396 |
| 1843.0 | 7.428 |
| 1844.0 | 7.44 |
| 1845.0 | 7.397 |
| 1846.0 | 7.358 |
| 1847.0 | 7.382 |
| 1848.0 | 7.38 |
| 1849.0 | 7.366 |
| 1850.0 | 7.421 |
| 1851.0 | 7.421 |
| 1852.0 | 7.421 |
| 1853.0 | 7.447 |
| 1854.0 | 7.449 |
| 1855.0 | 7.423 |
| 1856.0 | 7.416 |
| 1857.0 | 7.423 |
| 1858.0 | 7.451 |
| 1859.0 | 7.403 |
| 1860.0 | 7.401 |
| 1861.0 | 7.428 |
| 1862.0 | 7.378 |
| 1863.0 | 7.38 |
| 1864.0 | 7.389 |
| 1865.0 | 7.383 |
| 1866.0 | 7.393 |
| 1867.0 | 7.373 |
| 1868.0 | 7.411 |
| 1869.0 | 7.425 |
| 1870.0 | 7.363 |
| 1871.0 | 7.378 |
| 1872.0 | 7.375 |
| 1873.0 | 7.365 |
| 1874.0 | 7.429 |
| 1875.0 | 7.497 |
| 1876.0 | 7.475 |
| 1877.0 | 7.464 |
| 1878.0 | 7.467 |
| 1879.0 | 7.459 |
| 1880.0 | 7.456 |
| 1881.0 | 7.444 |
| 1882.0 | 7.481 |
| 1883.0 | 7.49 |
| 1884.0 | 7.445 |
| 1885.0 | 7.422 |
| 1886.0 | 7.365 |
| 1887.0 | 7.43 |
| 1888.0 | 7.434 |
| 1889.0 | 7.365 |
| 1890.0 | 7.393 |
| 1891.0 | 7.408 |
| 1892.0 | 7.452 |
| 1893.0 | 7.452 |
| 1894.0 | 7.404 |
| 1895.0 | 7.434 |
| 1896.0 | 7.399 |
| 1897.0 | 7.356 |
| 1898.0 | 7.345 |
| 1899.0 | 7.373 |
| 1900.0 | 7.474 |
| 1901.0 | 7.486 |
| 1902.0 | 7.47 |
| 1903.0 | 7.48 |
| 1904.0 | 7.449 |
| 1905.0 | 7.414 |
| 1906.0 | 7.482 |
| 1907.0 | 7.491 |
| 1908.0 | 7.411 |
| 1909.0 | 7.408 |
| 1910.0 | 7.397 |
| 1911.0 | 7.411 |
| 1912.0 | 7.397 |
| 1913.0 | 7.377 |
| 1914.0 | 7.458 |
| 1915.0 | 7.488 |
| 1916.0 | 7.452 |
| 1917.0 | 7.514 |
| 1918.0 | 7.519 |
| 1919.0 | 7.486 |
| 1920.0 | 7.471 |
| 1921.0 | 7.46 |
| 1922.0 | 7.432 |
| 1923.0 | 7.423 |
| 1924.0 | 7.521 |
| 1925.0 | 7.503 |
| 1926.0 | 7.486 |
| 1927.0 | 7.506 |
| 1928.0 | 7.476 |
| 1929.0 | 7.507 |
| 1930.0 | 7.575 |
| 1931.0 | 7.545 |
| 1932.0 | 7.514 |
| 1933.0 | 7.548 |
| 1934.0 | 7.532 |
| 1935.0 | 7.512 |
| 1936.0 | 7.51 |
| 1937.0 | 7.524 |
| 1938.0 | 7.536 |
| 1939.0 | 7.524 |
| 1940.0 | 7.527 |
| 1941.0 | 7.512 |
| 1942.0 | 7.524 |
| 1943.0 | 7.587 |
| 1944.0 | 7.56 |
| 1945.0 | 7.514 |
| 1946.0 | 7.533 |
| 1947.0 | 7.541 |
| 1948.0 | 7.556 |
| 1949.0 | 7.547 |
| 1950.0 | 7.545 |
| 1951.0 | 7.557 |
| 1952.0 | 7.554 |
| 1953.0 | 7.562 |
| 1954.0 | 7.563 |
| 1955.0 | 7.559 |
| 1956.0 | 7.548 |
| 1957.0 | 7.549 |
| 1958.0 | 7.548 |
| 1959.0 | 7.585 |
| 1960.0 | 7.607 |
| 1961.0 | 7.597 |
| 1962.0 | 7.582 |
| 1963.0 | 7.584 |
| 1964.0 | 7.575 |
| 1965.0 | 7.565 |
| 1966.0 | 7.587 |
| 1967.0 | 7.59 |
| 1968.0 | 7.589 |
| 1969.0 | 7.581 |
| 1970.0 | 7.588 |
| 1971.0 | 7.595 |
| 1972.0 | 7.618 |
| 1973.0 | 7.628 |
| 1974.0 | 7.601 |
| 1975.0 | 7.584 |
| 1976.0 | 7.556 |
| 1977.0 | 7.559 |
| 1978.0 | 7.599 |
| 1979.0 | 7.61 |
| 1980.0 | 7.594 |
| 1981.0 | 7.614 |
| 1982.0 | 7.62 |
| 1983.0 | 7.598 |
| 1984.0 | 7.597 |
| 1985.0 | 7.588 |
| 1986.0 | 7.62 |
| 1987.0 | 7.633 |
| 1988.0 | 7.637 |
| 1989.0 | 7.611 |
| 1990.0 | 7.623 |
| 1991.0 | 7.633 |
| 1992.0 | 7.651 |
| 1993.0 | 7.657 |
| 1994.0 | 7.612 |
| 1995.0 | 7.575 |
| 1996.0 | 7.582 |
| 1997.0 | 7.587 |
| 1998.0 | 7.606 |
| 1999.0 | 7.598 |
| 2000.0 | 7.618 |
| 2001.0 | 7.572 |
| 2002.0 | 7.536 |
| 2003.0 | 7.586 |
| 2004.0 | 7.581 |
| 2005.0 | 7.576 |
| 2006.0 | 7.549 |
| 2007.0 | 7.545 |
| 2008.0 | 7.565 |
| 2009.0 | 7.573 |
| 2010.0 | 7.528 |
| 2011.0 | 7.54 |
| 2012.0 | 7.588 |
| 2013.0 | 7.599 |
| 2014.0 | 7.579 |
| 2015.0 | 7.601 |
| 2016.0 | 7.611 |
| 2017.0 | 7.605 |
| 2018.0 | 7.586 |
| 2019.0 | 7.574 |
| 2020.0 | 7.535 |
| 2021.0 | 7.58 |
| 2022.0 | 7.619 |
| 2023.0 | 7.621 |
| 2024.0 | 7.611 |
| 2025.0 | 7.61 |
| 2026.0 | 7.6 |
| 2027.0 | 7.589 |
| 2028.0 | 7.611 |
| 2029.0 | 7.605 |
| 2030.0 | 7.594 |
| 2031.0 | 7.568 |
| 2032.0 | 7.583 |
| 2033.0 | 7.605 |
| 2034.0 | 7.578 |
| 2035.0 | 7.56 |
| 2036.0 | 7.587 |
| 2037.0 | 7.583 |
| 2038.0 | 7.604 |
| 2039.0 | 7.587 |
| 2040.0 | 7.592 |
| 2041.0 | 7.588 |
| 2042.0 | 7.585 |
| 2043.0 | 7.602 |
| 2044.0 | 7.636 |
| 2045.0 | 7.655 |
| 2046.0 | 7.644 |
| 2047.0 | 7.629 |
| 2048.0 | 7.62 |
| 2049.0 | 7.608 |
| 2050.0 | 7.582 |
| 2051.0 | 7.623 |
| 2052.0 | 7.601 |
| 2053.0 | 7.615 |
| 2054.0 | 7.574 |
| 2055.0 | 7.581 |
| 2056.0 | 7.561 |
| 2057.0 | 7.629 |
| 2058.0 | 7.637 |
| 2059.0 | 7.626 |
| 2060.0 | 7.613 |
| 2061.0 | 7.59 |
| 2062.0 | 7.611 |
| 2063.0 | 7.628 |
| 2064.0 | 7.607 |
| 2065.0 | 7.638 |
| 2066.0 | 7.609 |
| 2067.0 | 7.615 |
| 2068.0 | 7.57 |
| 2069.0 | 7.57 |
| 2070.0 | 7.518 |
| 2071.0 | 7.573 |
| 2072.0 | 7.612 |
| 2073.0 | 7.583 |
| 2074.0 | 7.598 |
| 2075.0 | 7.566 |
| 2076.0 | 7.615 |
| 2077.0 | 7.627 |
| 2078.0 | 7.626 |
| 2079.0 | 7.606 |
| 2080.0 | 7.629 |
| 2081.0 | 7.654 |
| 2082.0 | 7.65 |
| 2083.0 | 7.651 |
| 2084.0 | 7.657 |
| 2085.0 | 7.688 |
| 2086.0 | 7.646 |
| 2087.0 | 7.595 |
| 2088.0 | 7.666 |
| 2089.0 | 7.615 |
| 2090.0 | 7.667 |
| 2091.0 | 7.575 |
| 2092.0 | 7.562 |
| 2093.0 | 7.638 |
| 2094.0 | 7.62 |
| 2095.0 | 7.649 |
| 2096.0 | 7.663 |
| 2097.0 | 7.723 |
| 2098.0 | 7.648 |
| 2099.0 | 7.638 |
| 2100.0 | 7.592 |
| 2101.0 | 7.712 |
| 2102.0 | 7.633 |
| 2103.0 | 7.611 |
| 2104.0 | 7.636 |
| 2105.0 | 7.711 |
| 2106.0 | 7.687 |
| 2107.0 | 7.724 |
| 2108.0 | 7.682 |
| 2109.0 | 7.641 |
| 2110.0 | 7.686 |
| 2111.0 | 7.723 |
| 2112.0 | 7.72 |
| 2113.0 | 7.68 |
| 2114.0 | 7.702 |
| 2115.0 | 7.666 |
| 2116.0 | 7.703 |
| 2117.0 | 7.715 |
| 2118.0 | 7.673 |
| 2119.0 | 7.675 |
| 2120.0 | 7.707 |
| 2121.0 | 7.73 |
| 2122.0 | 7.712 |
| 2123.0 | 7.709 |
| 2124.0 | 7.785 |
| 2125.0 | 7.636 |
| 2126.0 | 7.659 |
| 2127.0 | 7.679 |
| 2128.0 | 7.651 |
| 2129.0 | 7.748 |
| 2130.0 | 7.701 |
| 2131.0 | 7.728 |
| 2132.0 | 7.73 |
| 2133.0 | 7.76 |
| 2134.0 | 7.678 |
| 2135.0 | 7.651 |
| 2136.0 | 7.679 |
| 2137.0 | 7.726 |
| 2138.0 | 7.717 |
| 2139.0 | 7.732 |
| 2140.0 | 7.67 |
| 2141.0 | 7.698 |
| 2142.0 | 7.727 |
| 2143.0 | 7.68 |
| 2144.0 | 7.674 |
| 2145.0 | 7.777 |
| 2146.0 | 7.736 |
| 2147.0 | 7.744 |
| 2148.0 | 7.801 |
| 2149.0 | 7.763 |
| 2150.0 | 7.716 |
| 2151.0 | 7.753 |
| 2152.0 | 7.745 |
| 2153.0 | 7.745 |
| 2154.0 | 7.713 |
| 2155.0 | 7.707 |
| 2156.0 | 7.741 |
| 2157.0 | 7.713 |
| 2158.0 | 7.684 |
| 2159.0 | 7.701 |
| 2160.0 | 7.693 |
| 2161.0 | 7.658 |
| 2162.0 | 7.614 |
| 2163.0 | 7.629 |
| 2164.0 | 7.731 |
| 2165.0 | 7.691 |
| 2166.0 | 7.703 |
| 2167.0 | 7.73 |
| 2168.0 | 7.771 |
| 2169.0 | 7.681 |
| 2170.0 | 7.657 |
| 2171.0 | 7.713 |
| 2172.0 | 7.739 |
| 2173.0 | 7.724 |
| 2174.0 | 7.753 |
| 2175.0 | 7.707 |
| 2176.0 | 7.785 |
| 2177.0 | 7.657 |
| 2178.0 | 7.658 |
| 2179.0 | 7.645 |
| 2180.0 | 7.7 |
| 2181.0 | 7.752 |
| 2182.0 | 7.728 |
| 2183.0 | 7.689 |
| 2184.0 | 7.732 |
| 2185.0 | 7.679 |
| 2186.0 | 7.752 |
| 2187.0 | 7.615 |
| 2188.0 | 7.645 |
| 2189.0 | 7.69 |
| 2190.0 | 7.622 |
| 2191.0 | 7.711 |
| 2192.0 | 7.702 |
| 2193.0 | 7.786 |
| 2194.0 | 7.685 |
| 2195.0 | 7.733 |
| 2196.0 | 7.705 |
| 2197.0 | 7.696 |
| 2198.0 | 7.744 |
| 2199.0 | 7.73 |
| 2200.0 | 7.7 |
| 2201.0 | 7.663 |
| 2202.0 | 7.66 |
| 2203.0 | 7.732 |
| 2204.0 | 7.544 |
| 2205.0 | 7.598 |
| 2206.0 | 7.591 |
| 2207.0 | 7.662 |
| 2208.0 | 7.639 |
| 2209.0 | 7.687 |
| 2210.0 | 7.769 |
| 2211.0 | 7.682 |
| 2212.0 | 7.651 |
| 2213.0 | 7.672 |
| 2214.0 | 7.623 |
| 2215.0 | 7.761 |
| 2216.0 | 7.782 |
| 2217.0 | 7.688 |
| 2218.0 | 7.599 |
| 2219.0 | 7.566 |
| 2220.0 | 7.579 |
| 2221.0 | 7.724 |
| 2222.0 | 7.63 |
| 2223.0 | 7.623 |
| 2224.0 | 7.654 |
| 2225.0 | 7.6 |
| 2226.0 | 7.594 |
| 2227.0 | 7.534 |
| 2228.0 | 7.658 |
| 2229.0 | 7.682 |
| 2230.0 | 7.612 |
| 2231.0 | 7.632 |
| 2232.0 | 7.587 |
| 2233.0 | 7.654 |
| 2234.0 | 7.683 |
| 2235.0 | 7.692 |
| 2236.0 | 7.669 |
| 2237.0 | 7.598 |
| 2238.0 | 7.745 |
| 2239.0 | 7.7 |
| 2240.0 | 7.658 |
| 2241.0 | 7.636 |
| 2242.0 | 7.783 |
| 2243.0 | 7.605 |
| 2244.0 | 7.619 |
| 2245.0 | 7.682 |
| 2246.0 | 7.556 |
| 2247.0 | 7.658 |
| 2248.0 | 7.663 |
| 2249.0 | 7.539 |
| 2250.0 | 7.559 |
| 2251.0 | 7.679 |
| 2252.0 | 7.765 |
| 2253.0 | 7.73 |
| 2254.0 | 7.752 |
| 2255.0 | 7.705 |
| 2256.0 | 7.647 |
| 2257.0 | 7.703 |
| 2258.0 | 7.561 |
| 2259.0 | 7.545 |
| 2260.0 | 7.599 |
| 2261.0 | 7.64 |
| 2262.0 | 7.669 |
| 2263.0 | 7.597 |
| 2264.0 | 7.597 |
| 2265.0 | 7.731 |
| 2266.0 | 7.705 |
| 2267.0 | 7.653 |
| 2268.0 | 7.716 |
| 2269.0 | 7.666 |
| 2270.0 | 7.682 |
| 2271.0 | 7.655 |
| 2272.0 | 7.586 |
| 2273.0 | 7.635 |
| 2274.0 | 7.73 |
| 2275.0 | 7.73 |
| 2276.0 | 7.701 |
| 2277.0 | 7.723 |
| 2278.0 | 7.632 |
| 2279.0 | 7.619 |
| 2280.0 | 7.591 |
| 2281.0 | 7.622 |
| 2282.0 | 7.689 |
| 2283.0 | 7.746 |
| 2284.0 | 7.666 |
| 2285.0 | 7.694 |
| 2286.0 | 7.763 |
| 2287.0 | 7.787 |
| 2288.0 | 7.714 |
| 2289.0 | 7.675 |
| 2290.0 | 7.687 |
| 2291.0 | 7.733 |
| 2292.0 | 7.729 |
| 2293.0 | 7.786 |
| 2294.0 | 7.813 |
| 2295.0 | 7.715 |
| 2296.0 | 7.694 |
| 2297.0 | 7.726 |
| 2298.0 | 7.766 |
| 2299.0 | 7.72 |
| 2300.0 | 7.716 |
| 2301.0 | 7.712 |
| 2302.0 | 7.691 |
| 2303.0 | 7.752 |
| 2304.0 | 7.712 |
| 2305.0 | 7.689 |
| 2306.0 | 7.645 |
| 2307.0 | 7.662 |
| 2308.0 | 7.67 |
| 2309.0 | 7.582 |
| 2310.0 | 7.715 |
| 2311.0 | 7.775 |
| 2312.0 | 7.707 |
| 2313.0 | 7.727 |
| 2314.0 | 7.638 |
| 2315.0 | 7.609 |
| 2316.0 | 7.739 |
| 2317.0 | 7.76 |
| 2318.0 | 7.726 |
| 2319.0 | 7.716 |
| 2320.0 | 7.67 |
| 2321.0 | 7.666 |
| 2322.0 | 7.723 |
| 2323.0 | 7.727 |
| 2324.0 | 7.69 |
| 2325.0 | 7.718 |
| 2326.0 | 7.725 |
| 2327.0 | 7.655 |
| 2328.0 | 7.639 |
| 2329.0 | 7.69 |
| 2330.0 | 7.674 |
| 2331.0 | 7.682 |
| 2332.0 | 7.695 |
| 2333.0 | 7.683 |
| 2334.0 | 7.762 |
| 2335.0 | 7.865 |
| 2336.0 | 7.818 |
| 2337.0 | 7.74 |
| 2338.0 | 7.786 |
| 2339.0 | 7.787 |
| 2340.0 | 7.846 |
| 2341.0 | 7.754 |
| 2342.0 | 7.658 |
| 2343.0 | 7.743 |
| 2344.0 | 7.808 |
| 2345.0 | 7.782 |
| 2346.0 | 7.694 |
| 2347.0 | 7.713 |
| 2348.0 | 7.751 |
| 2349.0 | 7.705 |
| 2350.0 | 7.669 |
| 2351.0 | 7.677 |
| 2352.0 | 7.777 |
| 2353.0 | 7.83 |
| 2354.0 | 7.746 |
| 2355.0 | 7.81 |
| 2356.0 | 7.821 |
| 2357.0 | 7.756 |
| 2358.0 | 7.731 |
| 2359.0 | 7.746 |
| 2360.0 | 7.704 |
| 2361.0 | 7.672 |
| 2362.0 | 7.781 |
| 2363.0 | 7.7 |
| 2364.0 | 7.647 |
| 2365.0 | 7.747 |
| 2366.0 | 7.732 |
| 2367.0 | 7.68 |
| 2368.0 | 7.719 |
| 2369.0 | 7.711 |
| 2370.0 | 7.817 |
| 2371.0 | 7.816 |
| 2372.0 | 7.684 |
| 2373.0 | 7.715 |
| 2374.0 | 7.806 |
| 2375.0 | 7.8 |
| 2376.0 | 7.781 |
| 2377.0 | 7.748 |
| 2378.0 | 7.736 |
| 2379.0 | 7.776 |
| 2380.0 | 7.737 |
| 2381.0 | 7.61 |
| 2382.0 | 7.707 |
| 2383.0 | 7.725 |
| 2384.0 | 7.665 |
| 2385.0 | 7.626 |
| 2386.0 | 7.759 |
| 2387.0 | 7.856 |
| 2388.0 | 7.846 |
| 2389.0 | 7.708 |
| 2390.0 | 7.674 |
| 2391.0 | 7.676 |
| 2392.0 | 7.752 |
| 2393.0 | 7.827 |
| 2394.0 | 7.905 |
| 2395.0 | 7.851 |
| 2396.0 | 7.812 |
| 2397.0 | 7.743 |
| 2398.0 | 7.705 |
| 2399.0 | 7.667 |
| 2400.0 | 7.688 |
| 2401.0 | 7.702 |
| 2402.0 | 7.606 |
| 2403.0 | 7.703 |
| 2404.0 | 7.724 |
| 2405.0 | 7.752 |
| 2406.0 | 7.665 |
| 2407.0 | 7.71 |
| 2408.0 | 7.699 |
| 2409.0 | 7.585 |
| 2410.0 | 7.699 |
| 2411.0 | 7.722 |
| 2412.0 | 7.725 |
| 2413.0 | 7.674 |
| 2414.0 | 7.619 |
| 2415.0 | 7.625 |
| 2416.0 | 7.777 |
| 2417.0 | 7.712 |
| 2418.0 | 7.605 |
| 2419.0 | 7.755 |
| 2420.0 | 7.77 |
| 2421.0 | 7.746 |
| 2422.0 | 7.664 |
| 2423.0 | 7.76 |
| 2424.0 | 7.55 |
| 2425.0 | 7.654 |
| 2426.0 | 7.74 |
| 2427.0 | 7.768 |
| 2428.0 | 7.641 |
| 2429.0 | 7.747 |
| 2430.0 | 7.682 |
| 2431.0 | 7.567 |
| 2432.0 | 7.544 |
| 2433.0 | 7.657 |
| 2434.0 | 7.683 |
| 2435.0 | 7.968 |
| 2436.0 | 7.849 |
| 2437.0 | 7.932 |
| 2438.0 | 7.836 |
| 2439.0 | 7.771 |
| 2440.0 | 7.49 |
| 2441.0 | 7.73 |
| 2442.0 | 7.737 |
| 2443.0 | 7.733 |
| 2444.0 | 7.737 |
| 2445.0 | 7.906 |
| 2446.0 | 7.532 |
| 2447.0 | 7.636 |
| 2448.0 | 7.422 |
| 2449.0 | 7.584 |
| 2450.0 | 7.733 |
| 2451.0 | 7.806 |
| 2452.0 | 7.694 |
| 2453.0 | 7.814 |
| 2454.0 | 7.891 |
| 2455.0 | 7.802 |
| 2456.0 | 7.669 |
| 2457.0 | 7.634 |
| 2458.0 | 7.782 |
| 2459.0 | 7.565 |
| 2460.0 | 7.559 |
| 2461.0 | 7.755 |
| 2462.0 | 7.623 |
| 2463.0 | 7.675 |
| 2464.0 | 7.802 |
| 2465.0 | 7.735 |
| 2466.0 | 7.603 |
| 2467.0 | 7.671 |
| 2468.0 | 7.611 |
| 2469.0 | 7.727 |
| 2470.0 | 7.867 |
| 2471.0 | 8.031 |
| 2472.0 | 7.513 |
| 2473.0 | 7.575 |
| 2474.0 | 7.873 |
| 2475.0 | 8.012 |
| 2476.0 | 7.893 |
| 2477.0 | 7.798 |
| 2478.0 | 7.447 |
| 2479.0 | 7.763 |
| 2480.0 | 7.717 |
| 2481.0 | 7.696 |
| 2482.0 | 7.7 |
| 2483.0 | 7.589 |
| 2484.0 | 7.844 |
| 2485.0 | 7.781 |
| 2486.0 | 7.79 |
| 2487.0 | 7.667 |
| 2488.0 | 7.71 |
| 2489.0 | 7.612 |
| 2490.0 | 7.773 |
| 2491.0 | 7.892 |
| 2492.0 | 7.747 |
| 2493.0 | 7.96 |
| 2494.0 | 7.96 |
| 2495.0 | 7.751 |
| 2496.0 | 7.651 |
| 2497.0 | 7.582 |
| 2498.0 | 7.849 |
| 2499.0 | 7.952 |
| 2500.0 | 7.73 |